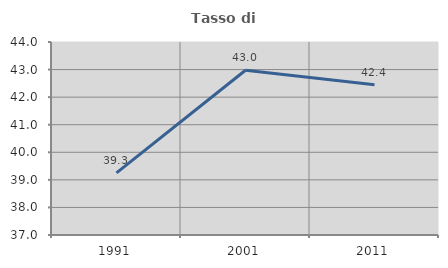
| Category | Tasso di occupazione   |
|---|---|
| 1991.0 | 39.251 |
| 2001.0 | 42.975 |
| 2011.0 | 42.447 |